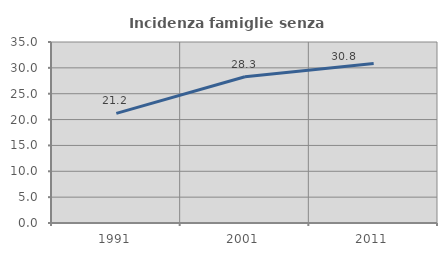
| Category | Incidenza famiglie senza nuclei |
|---|---|
| 1991.0 | 21.198 |
| 2001.0 | 28.277 |
| 2011.0 | 30.829 |